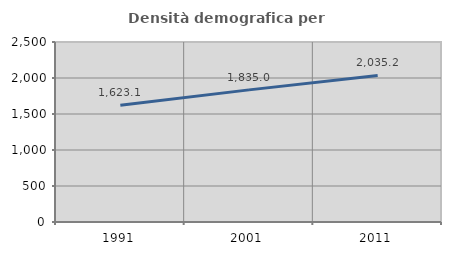
| Category | Densità demografica |
|---|---|
| 1991.0 | 1623.09 |
| 2001.0 | 1834.983 |
| 2011.0 | 2035.191 |